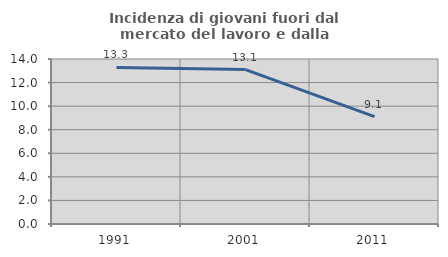
| Category | Incidenza di giovani fuori dal mercato del lavoro e dalla formazione  |
|---|---|
| 1991.0 | 13.287 |
| 2001.0 | 13.105 |
| 2011.0 | 9.115 |